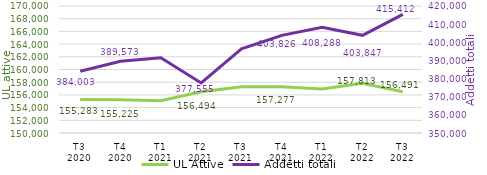
| Category | UL Attive |
|---|---|
| T3
2020 | 155283 |
| T4
2020 | 155225 |
| T1
2021 | 155087 |
| T2
2021 | 156494 |
| T3
2021 | 157291 |
| T4
2021 | 157277 |
| T1
2022 | 156942 |
| T2
2022 | 157813 |
| T3
2022 | 156491 |